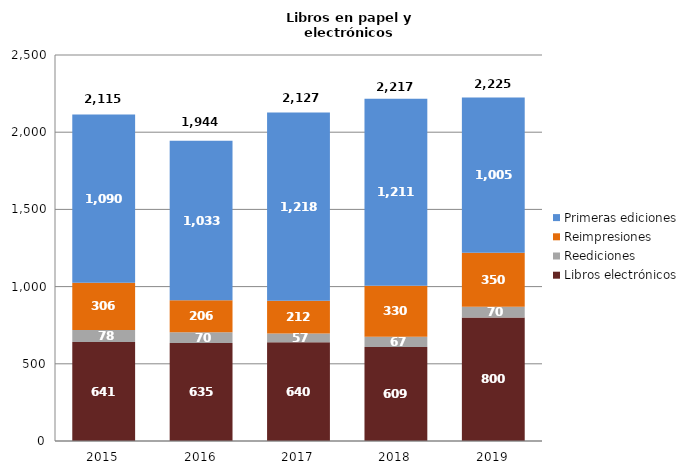
| Category | Libros electrónicos | Reediciones | Reimpresiones | Primeras ediciones |
|---|---|---|---|---|
| 2015.0 | 641 | 78 | 306 | 1090 |
| 2016.0 | 635 | 70 | 206 | 1033 |
| 2017.0 | 640 | 57 | 212 | 1218 |
| 2018.0 | 609 | 67 | 330 | 1211 |
| 2019.0 | 800 | 70 | 350 | 1005 |